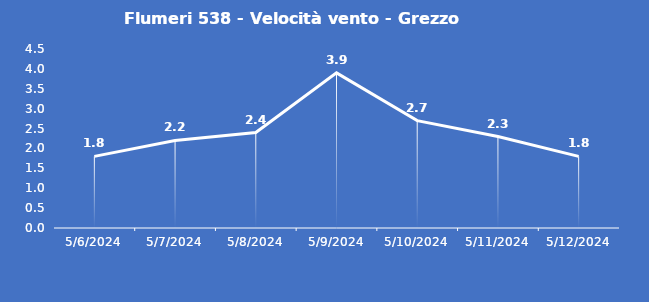
| Category | Flumeri 538 - Velocità vento - Grezzo (m/s) |
|---|---|
| 5/6/24 | 1.8 |
| 5/7/24 | 2.2 |
| 5/8/24 | 2.4 |
| 5/9/24 | 3.9 |
| 5/10/24 | 2.7 |
| 5/11/24 | 2.3 |
| 5/12/24 | 1.8 |